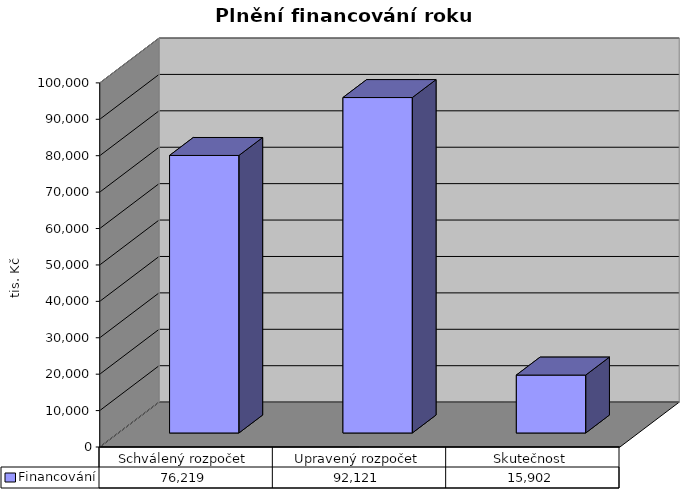
| Category | Financování |
|---|---|
| Schválený rozpočet | 76219 |
| Upravený rozpočet | 92121 |
| Skutečnost | 15902 |